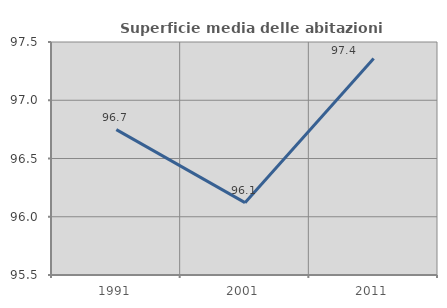
| Category | Superficie media delle abitazioni occupate |
|---|---|
| 1991.0 | 96.748 |
| 2001.0 | 96.121 |
| 2011.0 | 97.358 |